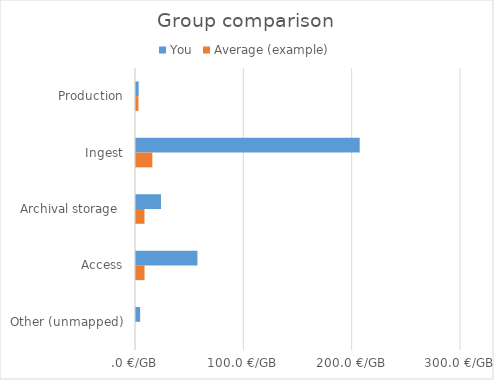
| Category | You | Average (example) |
|---|---|---|
| Production | 2.456 | 2.25 |
| Ingest | 206.491 | 15.08 |
| Archival storage  | 23.093 | 7.81 |
| Access | 56.725 | 7.89 |
| Other (unmapped) | 3.813 | 0 |